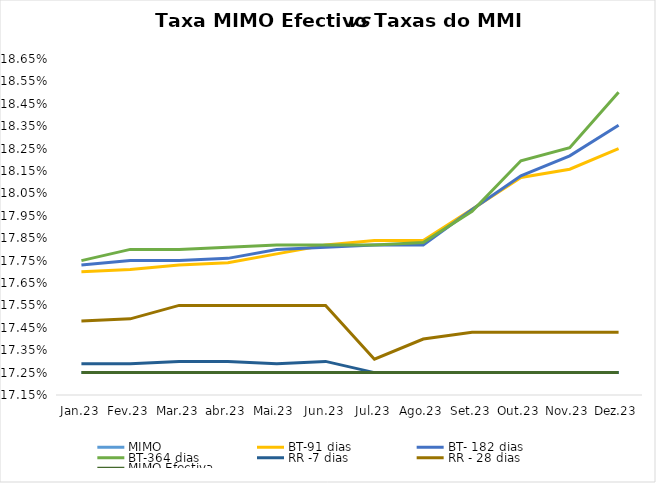
| Category | MIMO | BT-91 dias | BT- 182 dias | BT-364 dias | RR -7 dias | RR - 28 dias | MIMO Efectiva |
|---|---|---|---|---|---|---|---|
| Jan.23 | 0.172 | 0.177 | 0.177 | 0.178 | 0.173 | 0.175 | 0.172 |
| Fev.23 | 0.172 | 0.177 | 0.178 | 0.178 | 0.173 | 0.175 | 0.172 |
| Mar.23 | 0.172 | 0.177 | 0.178 | 0.178 | 0.173 | 0.176 | 0.172 |
| abr.23 | 0.172 | 0.177 | 0.178 | 0.178 | 0.173 | 0.176 | 0.172 |
| Mai.23 | 0.172 | 0.178 | 0.178 | 0.178 | 0.173 | 0.176 | 0.172 |
| Jun.23 | 0.172 | 0.178 | 0.178 | 0.178 | 0.173 | 0.176 | 0.172 |
| Jul.23 | 0.172 | 0.178 | 0.178 | 0.178 | 0.172 | 0.173 | 0.172 |
| Ago.23 | 0.172 | 0.178 | 0.178 | 0.178 | 0.172 | 0.174 | 0.172 |
| Set.23 | 0.172 | 0.18 | 0.18 | 0.18 | 0.172 | 0.174 | 0.172 |
| Out.23 | 0.172 | 0.181 | 0.181 | 0.182 | 0.172 | 0.174 | 0.172 |
| Nov.23 | 0.172 | 0.182 | 0.182 | 0.183 | 0.172 | 0.174 | 0.172 |
| Dez.23 | 0.172 | 0.182 | 0.184 | 0.185 | 0.172 | 0.174 | 0.172 |